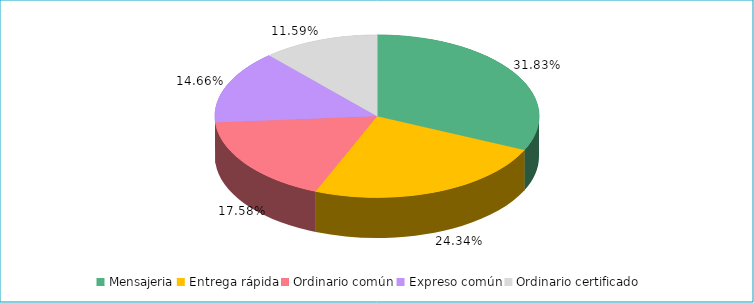
| Category | Series 0 |
|---|---|
| Mensajeria | 0.318 |
| Entrega rápida | 0.243 |
| Ordinario común | 0.176 |
| Expreso común | 0.147 |
| Ordinario certificado | 0.116 |